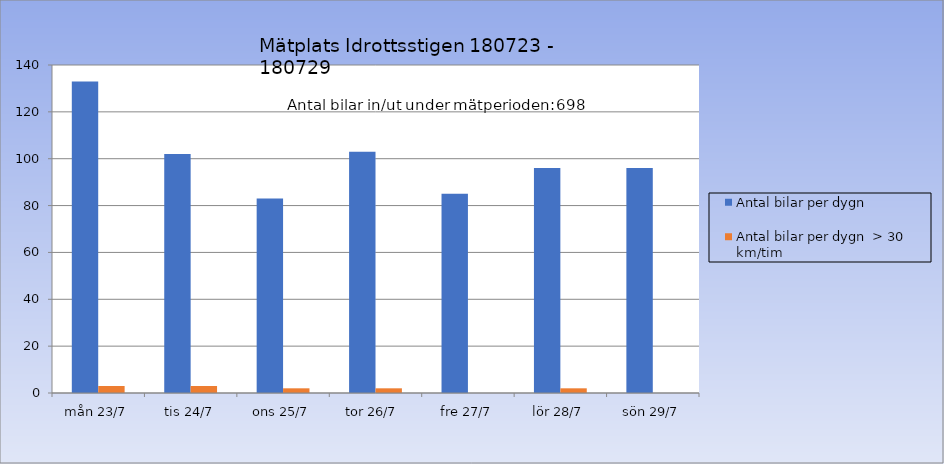
| Category | Antal bilar per dygn | Antal bilar per dygn  > 30 km/tim |
|---|---|---|
| mån 23/7 | 133 | 3 |
| tis 24/7 | 102 | 3 |
| ons 25/7 | 83 | 2 |
| tor 26/7  | 103 | 2 |
| fre 27/7 | 85 | 0 |
| lör 28/7 | 96 | 2 |
| sön 29/7 | 96 | 0 |